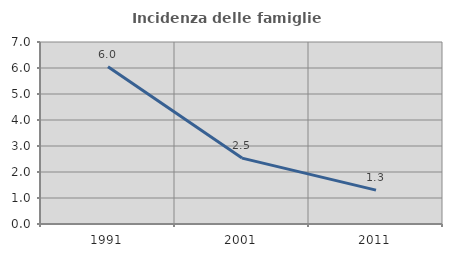
| Category | Incidenza delle famiglie numerose |
|---|---|
| 1991.0 | 6.049 |
| 2001.0 | 2.534 |
| 2011.0 | 1.303 |